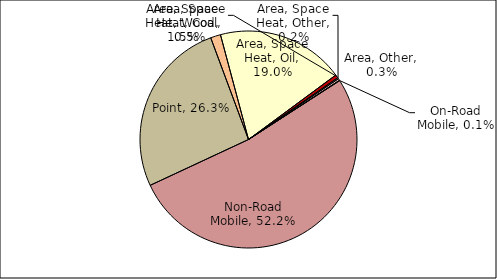
| Category | Series 0 |
|---|---|
| Point | 0.263 |
| Area, Space Heat, Wood | 0.015 |
| Area, Space Heat, Oil | 0.19 |
| Area, Space Heat, Coal | 0.005 |
| Area, Space Heat, Other | 0.002 |
| Area, Other | 0.003 |
| On-Road Mobile | 0.001 |
| Non-Road Mobile | 0.522 |